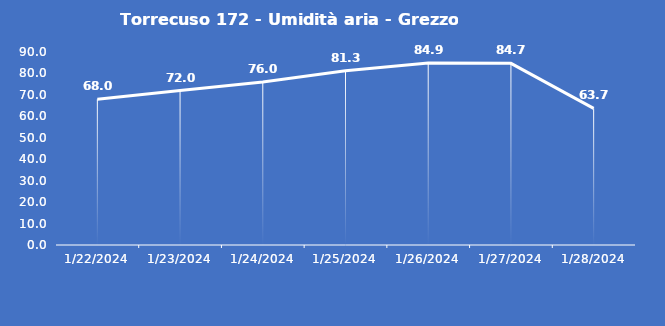
| Category | Torrecuso 172 - Umidità aria - Grezzo (%) |
|---|---|
| 1/22/24 | 68 |
| 1/23/24 | 72 |
| 1/24/24 | 76 |
| 1/25/24 | 81.3 |
| 1/26/24 | 84.9 |
| 1/27/24 | 84.7 |
| 1/28/24 | 63.7 |